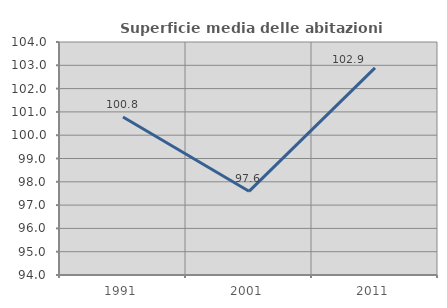
| Category | Superficie media delle abitazioni occupate |
|---|---|
| 1991.0 | 100.778 |
| 2001.0 | 97.592 |
| 2011.0 | 102.892 |